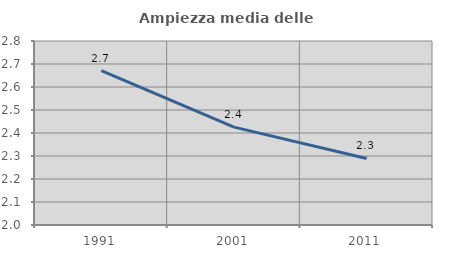
| Category | Ampiezza media delle famiglie |
|---|---|
| 1991.0 | 2.671 |
| 2001.0 | 2.426 |
| 2011.0 | 2.289 |